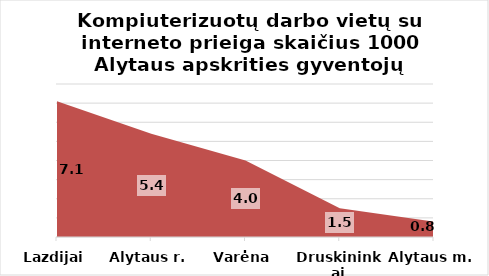
| Category | Series 0 |
|---|---|
| Lazdijai | 7.1 |
| Alytaus r. | 5.4 |
| Varėna | 4 |
| Druskininkai | 1.5 |
| Alytaus m. | 0.8 |